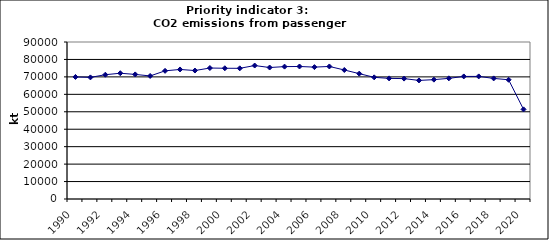
| Category | CO2 emissions from passenger cars, kt |
|---|---|
| 1990 | 69963.083 |
| 1991 | 69711.673 |
| 1992 | 71245.382 |
| 1993 | 72101.342 |
| 1994 | 71416.529 |
| 1995 | 70542.492 |
| 1996 | 73466.657 |
| 1997 | 74254.284 |
| 1998 | 73642.799 |
| 1999 | 75081.695 |
| 2000 | 74951.184 |
| 2001 | 74907.845 |
| 2002 | 76510.398 |
| 2003 | 75371.725 |
| 2004 | 75886.54 |
| 2005 | 75960.848 |
| 2006 | 75602.948 |
| 2007 | 75981.013 |
| 2008 | 73965.471 |
| 2009 | 71859.956 |
| 2010 | 69743.635 |
| 2011 | 69140.78 |
| 2012 | 69019.407 |
| 2013 | 67973.909 |
| 2014 | 68414.044 |
| 2015 | 69159.535 |
| 2016 | 70264.212 |
| 2017 | 70273.511 |
| 2018 | 69137.028 |
| 2019 | 68348.78 |
| 2020 | 51380.043 |